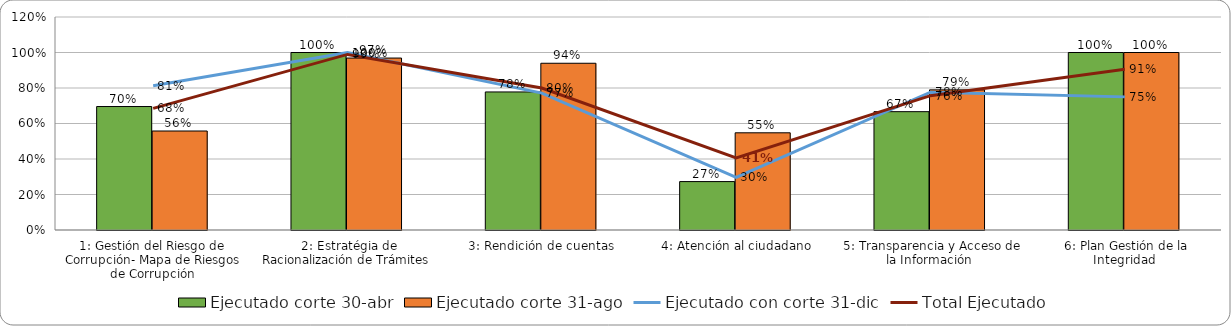
| Category | Ejecutado corte 30-abr | Ejecutado corte 31-ago |
|---|---|---|
| 1: Gestión del Riesgo de Corrupción- Mapa de Riesgos de Corrupción | 0.696 | 0.558 |
|  2: Estratégia de Racionalización de Trámites | 1 | 0.969 |
|  3: Rendición de cuentas | 0.778 | 0.939 |
|  4: Atención al ciudadano | 0.273 | 0.548 |
|  5: Transparencia y Acceso de la Información | 0.667 | 0.789 |
|  6: Plan Gestión de la Integridad | 1 | 1 |